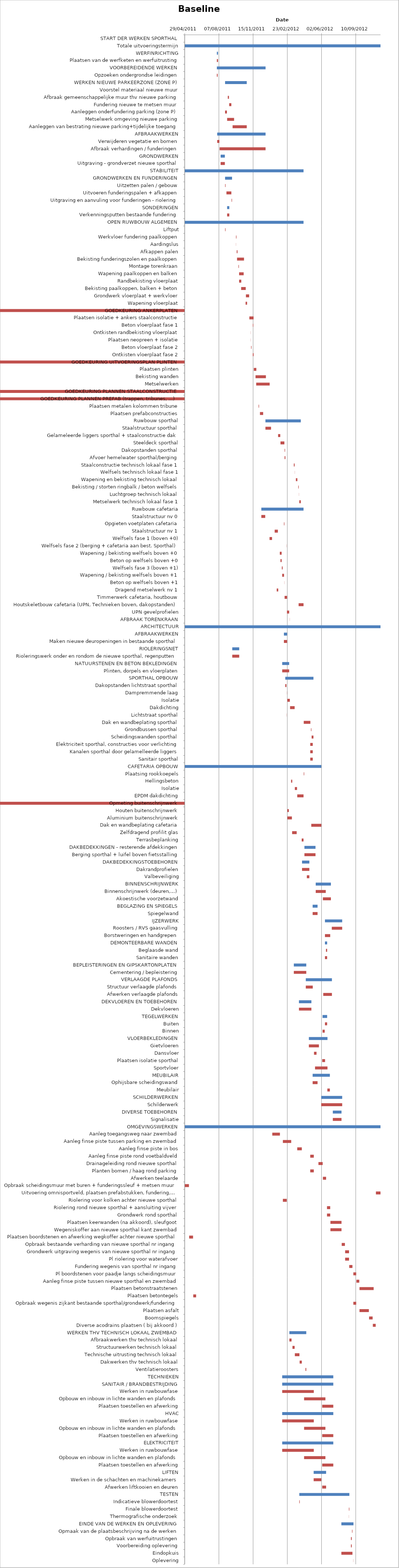
| Category | Baseline start | Actual duration |
|---|---|---|
| START DER WERKEN SPORTHAL | 40732.708 | 0 |
| Totale uitvoeringstermijn | 40662.333 | 572.375 |
| WERFINRICHTING | 40756.333 | 3.375 |
| Plaatsen van de werfketen en werfuitrusting | 40756.333 | 3.375 |
| VOORBEREIDENDE WERKEN | 40756.333 | 142.375 |
| Opzoeken ondergrondse leidingen | 40756.333 | 2.375 |
| WERKEN NIEUWE PARKEERZONE (ZONE P) | 40780.333 | 63.375 |
| Voorstel materiaal nieuwe muur | 40780.708 | 0 |
| Afbraak gemeenschappelijke muur thv nieuwe parking | 40788.333 | 3.375 |
| Fundering nieuwe te metsen muur | 40792.333 | 6.375 |
| Aanleggen onderfundering parking (zone P) | 40780.333 | 5.375 |
| Metselwerk omgeving nieuwe parking | 40786.333 | 20.375 |
| Aanleggen van bestrating nieuwe parking+tijdelijke toegang | 40802.333 | 41.375 |
| AFBRAAKWERKEN | 40757.333 | 141.375 |
| Verwijderen vegetatie en bomen | 40757.333 | 6.375 |
| Afbraak verhardingen / funderingen | 40764.333 | 134.375 |
| GRONDWERKEN | 40767.333 | 12.375 |
| Uitgraving - grondverzet nieuwe sporthal | 40767.333 | 12.375 |
| STABILITEIT | 40662.333 | 347.375 |
| GRONDWERKEN EN FUNDERINGEN | 40780.333 | 20.375 |
| Uitzetten palen / gebouw | 40780.333 | 1.375 |
| Uitvoeren funderingspalen + afkappen | 40784.333 | 14.375 |
| Uitgraving en aanvuling voor funderingen - riolering | 40799.333 | 1.375 |
| SONDERINGEN | 40786.333 | 6.375 |
| Verkenningsputten bestaande fundering | 40786.333 | 6.375 |
| OPEN RUWBOUW ALGEMEEN | 40662.333 | 347.375 |
| Liftput | 40780.333 | 1.375 |
| Werkvloer fundering paalkoppen | 40812.333 | 1.375 |
| Aardingslus | 40812.333 | 0.375 |
| Afkappen palen | 40814.333 | 2.375 |
| Bekisting funderingszolen en paalkoppen | 40815.333 | 20.375 |
| Montage torenkraan | 40819.333 | 1.375 |
| Wapening paalkoppen en balken | 40821.333 | 13.375 |
| Randbekisting vloerplaat | 40821.333 | 6.375 |
| Bekisting paalkoppen, balken + beton | 40827.333 | 13.375 |
| Grondwerk vloerplaat + werkvloer | 40841.333 | 9.375 |
| Wapening vloerplaat | 40840.333 | 4.375 |
| GOEDKEURING ANKERPLATEN | 40662.333 | -0.625 |
| Plaatsen isolatie + ankers staalconstructie | 40851.333 | 12.375 |
| Beton vloerplaat fase 1 | 40861.333 | 1.375 |
| Ontkisten randbekisting vloerplaat | 40855.333 | 0.375 |
| Plaatsen neopreen + isolatie | 40855.333 | 0.375 |
| Beton vloerplaat fase 2 | 40856.333 | 1.375 |
| Ontkisten vloerplaat fase 2 | 40861.333 | 2.375 |
| GOEDKEURING UITVOERINGSPLAN PLINTEN | 40662.333 | -0.625 |
| Plaatsen plinten | 40864.333 | 7.375 |
| Bekisting wanden | 40869.333 | 30.375 |
| Metselwerken | 40871.333 | 39.375 |
| GOEDKEURING PLANNEN STAALCONSTRUCTIE | 40662.333 | -0.625 |
| GOEDKEURING PLANNEN PREFAB (trappen, tribunes, ...) | 40662.333 | -0.625 |
| Plaatsen metalen kolommen tribune | 40878.333 | 1.375 |
| Plaatsen prefabconstructies | 40882.333 | 9.375 |
| Ruwbouw sporthal | 40898.333 | 103.375 |
| Staalstructuur sporthal | 40898.333 | 16.375 |
| Gelameleerde liggers sporthal + staalconstructie dak | 40935.333 | 6.375 |
| Steeldeck sporthal | 40942.333 | 11.375 |
| Dakopstanden sporthal | 40954.333 | 1.375 |
| Afvoer hemelwater sporthal/berging | 40954.333 | 2.375 |
| Staalconstructie technisch lokaal fase 1 | 40981.333 | 2.375 |
| Welfsels technisch lokaal fase 1 | 40984.333 | 0.375 |
| Wapening en bekisting technisch lokaal | 40987.333 | 4.375 |
| Bekisting / storten ringbalk / beton welfsels | 40994.333 | 1.375 |
| Luchtgroep technisch lokaal | 40996.333 | 0.375 |
| Metselwerk technisch lokaal fase 1 | 40997.333 | 4.375 |
| Ruwbouw cafetaria | 40886.333 | 123.375 |
| Staalstructuur nv 0 | 40886.333 | 11.375 |
| Opgieten voetplaten cafetaria | 40952.333 | 1.375 |
| Staalstructuur nv 1 | 40925.333 | 9.375 |
| Welfsels fase 1 (boven +0) | 40910.333 | 7.375 |
| Welfsels fase 2 (berging + cafetaria aan best. Sporthal) | 40960.333 | 0.375 |
| Wapening / bekisting welfsels boven +0 | 40940.333 | 5.375 |
| Beton op welfsels boven +0 | 40942.333 | 3.375 |
| Welfsels fase 3 (boven +1) | 40946.333 | 2.375 |
| Wapening / bekisting welfsels boven +1 | 40947.333 | 5.375 |
| Beton op welfsels boven +1 | 40953.333 | 0.375 |
| Dragend metselwerk nv 1 | 40931.333 | 4.375 |
| Timmerwerk cafetaria, houtbouw | 40954.333 | 7.375 |
| Houtskeletbouw cafetaria (UPN, Technieken boven, dakopstanden) | 40995.333 | 14.375 |
| UPN gevelprofielen | 40961.333 | 6.375 |
| AFBRAAK TORENKRAAN | 40969.333 | 0.375 |
| ARCHITECTUUR | 40662.333 | 572.375 |
| AFBRAAKWERKEN | 40952.333 | 9.375 |
| Maken nieuwe deuropeningen in bestaande sporthal | 40952.333 | 9.375 |
| RIOLERINGSNET | 40801.333 | 20.375 |
| Rioleringswerk onder en rondom de nieuwe sporthal, regenputten | 40801.333 | 20.375 |
| NATUURSTENEN EN BETON BEKLEDINGEN | 40947.333 | 20.375 |
| Plinten, dorpels en vloerplaten | 40947.333 | 20.375 |
| SPORTHAL OPBOUW | 40956.333 | 82.375 |
| Dakopstanden lichtstraat sporthal | 40956.333 | 3.375 |
| Dampremmende laag | 40961.333 | 0.375 |
| Isolatie | 40962.333 | 7.375 |
| Dakdichting | 40970.333 | 13.375 |
| Lichtstraat sporthal | 40960.333 | 0.375 |
| Dak en wandbeplating sporthal | 41010.333 | 19.375 |
| Grondbussen sporthal | 41031.333 | 1.375 |
| Scheidingswanden sporthal | 41033.333 | 5.375 |
| Elektriciteit sporthal, constructies voor verlichting | 41029.333 | 7.375 |
| Kanalen sporthal door gelamelleerde liggers | 41029.333 | 7.375 |
| Sanitair sporthal | 41029.333 | 7.375 |
| CAFETARIA OPBOUW | 40662.333 | 399.375 |
| Plaatsing rookkoepels | 41010.333 | 1.375 |
| Hellingsbeton | 40973.333 | 3.375 |
| Isolatie | 40984.333 | 6.375 |
| EPDM dakdichting | 40991.333 | 18.375 |
| Opmeting buitenschrijnwerk | 40662.333 | -0.625 |
| Houten buitenschrijnwerk | 40962.333 | 4.375 |
| Aluminium buitenschrijnwerk | 40962.333 | 13.375 |
| Dak en wandbeplating cafetaria | 41032.333 | 29.375 |
| Zelfdragend profilit glas | 40976.333 | 13.375 |
| Terrasbeplanking | 41004.333 | 5.375 |
| DAKBEDEKKINGEN - resterende afdekkingen | 41012.333 | 32.375 |
| Berging sporthal + luifel boven fietsstalling | 41012.333 | 32.375 |
| DAKBEDEKKINGSTOEBEHOREN | 41005.333 | 21.375 |
| Dakrandprofielen | 41005.333 | 21.375 |
| Valbeveiliging | 41019.333 | 7.375 |
| BINNENSCHRIJNWERK | 41045.333 | 44.375 |
| Binnenschrijnwerk (deuren,…) | 41045.333 | 29.375 |
| Akoestische voorzetwand | 41066.333 | 23.375 |
| BEGLAZING EN SPIEGELS | 41036.333 | 14.375 |
| Spiegelwand | 41036.333 | 14.375 |
| IJZERWERK | 41072.333 | 50.375 |
| Roosters / RVS gaasvulling | 41092.333 | 30.375 |
| Borstweringen en handgrepen | 41072.333 | 15.375 |
| DEMONTEERBARE WANDEN | 41072.333 | 6.375 |
| Beglaasde wand | 41075.333 | 3.375 |
| Sanitaire wanden | 41072.333 | 6.375 |
| BEPLEISTERINGEN EN GIPSKARTONPLATEN | 40981.333 | 36.375 |
| Cementering / bepleistering | 40981.333 | 36.375 |
| VERLAAGDE PLAFONDS | 41016.333 | 76.375 |
| Structuur verlaagde plafonds | 41016.333 | 20.375 |
| Afwerken verlaagde plafonds | 41067.333 | 25.375 |
| DEKVLOEREN EN TOEBEHOREN | 40996.333 | 36.375 |
| Dekvloeren | 40996.333 | 36.375 |
| TEGELWERKEN | 41065.333 | 13.375 |
| Buiten | 41072.333 | 6.375 |
| Binnen | 41065.333 | 6.375 |
| VLOERBEKLEDINGEN | 41025.333 | 54.375 |
| Gietvloeren | 41025.333 | 29.375 |
| Dansvloer | 41040.333 | 7.375 |
| Plaatsen isolatie sporthal | 41064.333 | 8.375 |
| Sportvloer | 41043.333 | 36.375 |
| MEUBILAIR | 41036.333 | 50.375 |
| Ophijsbare scheidingswand | 41036.333 | 14.375 |
| Meubilair | 41079.333 | 7.375 |
| SCHILDERWERKEN | 41061.333 | 61.375 |
| Schilderwerk | 41061.333 | 61.375 |
| DIVERSE TOEBEHOREN | 41095.333 | 25.375 |
| Signalisatie | 41095.333 | 25.375 |
| OMGEVINGSWERKEN | 40662.333 | 572.375 |
| Aanleg toegangsweg naar zwembad | 40918.333 | 22.375 |
| Aanleg finse piste tussen parking en zwembad | 40949.333 | 24.375 |
| Aanleg finse piste in bos | 40991.333 | 13.375 |
| Aanleg finse piste rond voetbaldveld | 41029.333 | 10.375 |
| Drainageleiding rond nieuwe sporthal | 41053.333 | 12.375 |
| Planten bomen / haag rond parking | 41029.333 | 10.375 |
| Afwerken teelaarde | 41066.333 | 9.375 |
| Opbraak scheidingsmuur met buren + funderingssleuf + metsen muur | 40662.333 | 12.375 |
| Uitvoering omnisportveld, plaatsen prefabstukken, fundering,… | 41221.333 | 13.375 |
| Riolering voor kolken achter nieuwe sporthal | 40949.333 | 11.375 |
| Riolering rond nieuwe sporthal + aansluiting vijver | 41078.333 | 9.375 |
| Grondwerk rond sporthal | 41078.333 | 9.375 |
| Plaatsen keerwanden (na akkoord), sleufgoot | 41088.333 | 32.375 |
| Wegeniskoffer aan nieuwe sporthal kant zwembad | 41088.333 | 32.375 |
| Plaatsen boordstenen en afwerking wegkoffer achter nieuwe sporthal | 40675.333 | 11.375 |
| Opbraak bestaande verharding van nieuwe sporthal nr ingang | 41121.333 | 9.375 |
| Grondwerk uitgraving wegenis van nieuwe sporthal nr ingang | 41131.333 | 11.375 |
| Pl riolering voor waterafvoer | 41131.333 | 11.375 |
| Fundering wegenis van sporthal nr ingang | 41143.333 | 9.375 |
| Pl boordstenen voor paadje langs scheidingsmuur | 41155.333 | 8.375 |
| Aanleg finse piste tussen nieuwe sporthal en zwembad | 41164.333 | 8.375 |
| Plaatsen betonstraatstenen | 41173.333 | 41.375 |
| Plaatsen betontegels | 40687.333 | 8.375 |
| Opbraak wegenis zijkant bestaande sporthal/grondwerk/fundering | 41155.333 | 8.375 |
| Plaatsen asfalt | 41173.333 | 27.375 |
| Boomspiegels | 41201.333 | 10.375 |
| Diverse acodrains plaatsen ( bij akkoord ) | 41212.333 | 8.375 |
| WERKEN THV TECHNISCH LOKAAL ZWEMBAD | 40968.333 | 49.375 |
| Afbraakwerken thv technisch lokaal | 40968.333 | 6.375 |
| Structuurwerken technisch lokaal | 40977.333 | 6.375 |
| Technische uitrusting technisch lokaal | 40984.333 | 13.375 |
| Dakwerken thv technisch lokaal | 40998.333 | 6.375 |
| Ventilatieroosters | 41015.333 | 2.375 |
| TECHNIEKEN | 40947.333 | 149.375 |
| SANITAIR / BRANDBESTRIJDING | 40947.333 | 149.375 |
| Werken in ruwbouwfase | 40947.333 | 92.375 |
| Opbouw en inbouw in lichte wanden en plafonds | 41011.333 | 62.375 |
| Plaatsen toestellen en afwerking | 41064.333 | 32.375 |
| HVAC | 40947.333 | 149.375 |
| Werken in ruwbouwfase | 40947.333 | 92.375 |
| Opbouw en inbouw in lichte wanden en plafonds | 41011.333 | 62.375 |
| Plaatsen toestellen en afwerking | 41064.333 | 32.375 |
| ELEKTRICITEIT | 40947.333 | 149.375 |
| Werken in ruwbouwfase | 40947.333 | 92.375 |
| Opbouw en inbouw in lichte wanden en plafonds | 41011.333 | 62.375 |
| Plaatsen toestellen en afwerking | 41064.333 | 32.375 |
| LIFTEN | 41039.333 | 36.375 |
| Werken in de schachten en machinekamers | 41039.333 | 22.375 |
| Afwerken liftkooien en deuren | 41064.333 | 11.375 |
| TESTEN | 40997.333 | 146.375 |
| Indicatieve blowerdoortest | 40997.333 | 1.375 |
| Finale blowerdoortest | 41142.333 | 1.375 |
| Thermografische onderzoek | 41142.333 | 0.375 |
| EINDE VAN DE WERKEN EN OPLEVERING | 41120.333 | 35.375 |
| Opmaak van de plaatsbeschrijving na de werken | 41151.333 | 1.375 |
| Opbraak van werfuitrustingen | 41148.333 | 2.375 |
| Voorbereiding oplevering | 41148.333 | 2.375 |
| Eindopkuis | 41120.333 | 32.375 |
| Oplevering | 41155.333 | 0.375 |